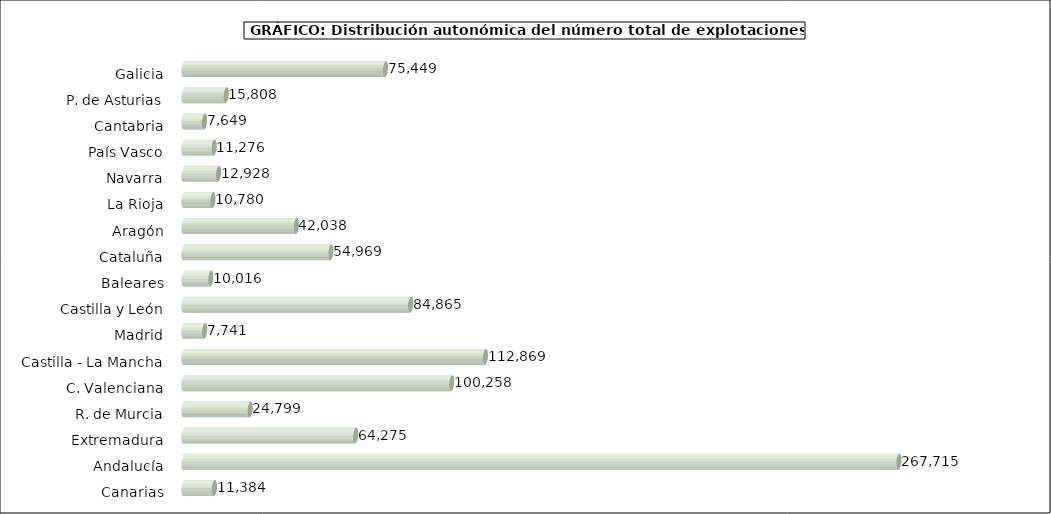
| Category | num. Explotaciones |
|---|---|
|   Galicia | 75449 |
|   P. de Asturias | 15808 |
|   Cantabria | 7649 |
|   País Vasco | 11276 |
|   Navarra | 12928 |
|   La Rioja | 10780 |
|   Aragón | 42038 |
|   Cataluña | 54969 |
|   Baleares | 10016 |
|   Castilla y León | 84865 |
|   Madrid | 7741 |
|   Castilla - La Mancha | 112869 |
|   C. Valenciana | 100258 |
|   R. de Murcia | 24799 |
|   Extremadura | 64275 |
|   Andalucía | 267715 |
|   Canarias | 11384 |